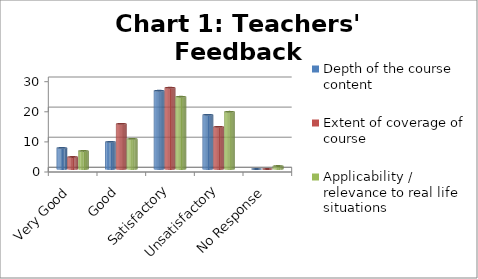
| Category | Depth of the course content | Extent of coverage of course | Applicability / relevance to real life situations |
|---|---|---|---|
| Very Good | 7 | 4 | 6 |
| Good | 9 | 15 | 10 |
| Satisfactory | 26 | 27 | 24 |
| Unsatisfactory | 18 | 14 | 19 |
| No Response | 0 | 0 | 1 |